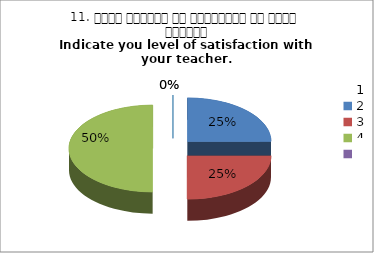
| Category | 11. अपने शिक्षक से संतुष्टि का स्तर बताइये
Indicate you level of satisfaction with your teacher.
 |
|---|---|
| 0 | 1 |
| 1 | 1 |
| 2 | 2 |
| 3 | 0 |
| 4 | 0 |